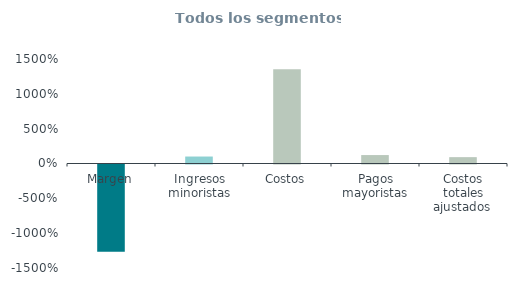
| Category | Todos los segmentos 
(% ingresos) |
|---|---|
| Margen | -12.534 |
| Ingresos minoristas | 1 |
| Costos | 13.534 |
| Pagos mayoristas | 1.21 |
| Costos totales ajustados  | 0.911 |